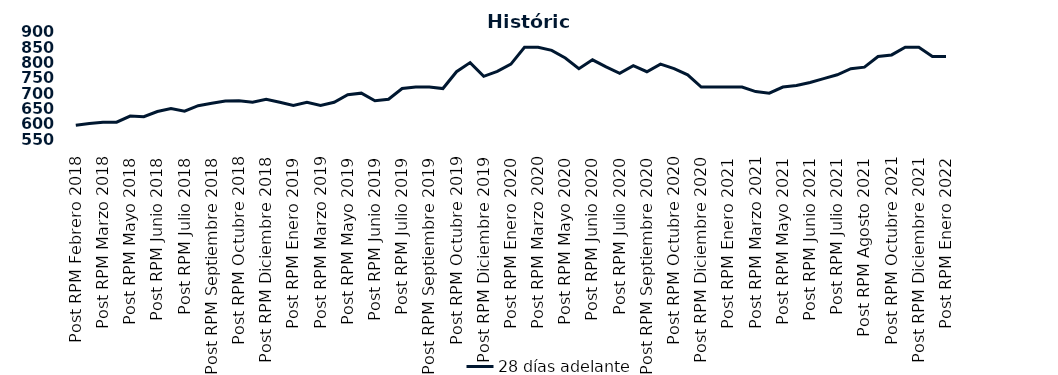
| Category | 28 días adelante |
|---|---|
| Post RPM Febrero 2018 | 595 |
| Pre RPM Marzo 2018 | 601 |
| Post RPM Marzo 2018 | 605 |
| Pre RPM Mayo 2018 | 605 |
| Post RPM Mayo 2018 | 625 |
| Pre RPM Junio 2018 | 623 |
| Post RPM Junio 2018 | 640 |
| Pre RPM Julio 2018 | 650 |
| Post RPM Julio 2018 | 641 |
| Pre RPM Septiembre 2018 | 659 |
| Post RPM Septiembre 2018 | 666.75 |
| Pre RPM Octubre 2018 | 674 |
| Post RPM Octubre 2018 | 675 |
| Pre RPM Diciembre 2018 | 670 |
| Post RPM Diciembre 2018 | 680 |
| Pre RPM Enero 2019 | 670 |
| Post RPM Enero 2019 | 660 |
| Pre RPM Marzo 2019 | 670 |
| Post RPM Marzo 2019 | 660 |
| Pre RPM Mayo 2019 | 670 |
| Post RPM Mayo 2019 | 695 |
| Pre RPM Junio 2019 | 700 |
| Post RPM Junio 2019 | 675 |
| Pre RPM Julio 2019 | 680 |
| Post RPM Julio 2019 | 715 |
| Pre RPM Septiembre 2019 | 720 |
| Post RPM Septiembre 2019 | 720 |
| Pre RPM Octubre 2019 | 715 |
| Post RPM Octubre 2019 | 770 |
| Pre RPM Diciembre 2019 | 800 |
| Post RPM Diciembre 2019 | 755 |
| Pre RPM Enero 2020 | 771 |
| Post RPM Enero 2020 | 795 |
| Pre RPM Marzo 2020 | 850 |
| Post RPM Marzo 2020 | 850 |
| Pre RPM Mayo 2020 | 840 |
| Post RPM Mayo 2020 | 815 |
| Pre RPM Junio 2020 | 780 |
| Post RPM Junio 2020 | 809 |
| Pre RPM Julio 2020 | 785.72 |
| Post RPM Julio 2020 | 765 |
| Pre RPM Septiembre 2020 | 790 |
| Post RPM Septiembre 2020 | 770 |
| Pre RPM Octubre 2020 | 795 |
| Post RPM Octubre 2020 | 780 |
| Pre RPM Diciembre 2020 | 760 |
| Post RPM Diciembre 2020 | 720 |
| Pre RPM Enero 2021 | 720 |
| Post RPM Enero 2021 | 720 |
| Pre RPM Marzo 2021 | 720 |
| Post RPM Marzo 2021 | 705 |
| Pre RPM Mayo 2021 | 700 |
| Post RPM Mayo 2021 | 720 |
| Pre RPM Junio 2021 | 725 |
| Post RPM Junio 2021 | 735 |
| Pre RPM Julio 2021 | 747.5 |
| Post RPM Julio 2021 | 760 |
| Pre RPM Agosto 2021 | 780 |
| Post RPM Agosto 2021 | 785 |
| Pre RPM Octubre 2021 | 820 |
| Post RPM Octubre 2021 | 825 |
| Pre RPM Diciembre 2021 | 850 |
| Post RPM Diciembre 2021 | 850 |
| Pre RPM Enero 2022 | 820 |
| Post RPM Enero 2022 | 820 |